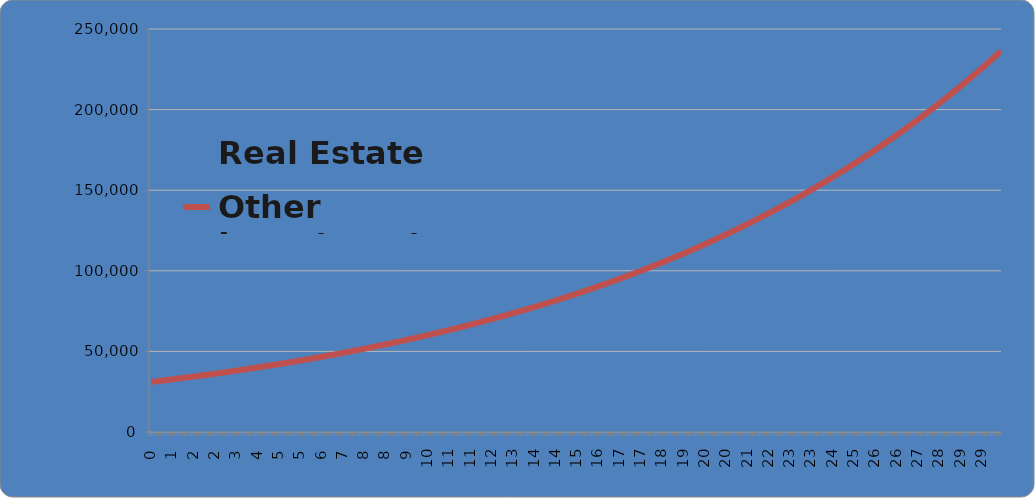
| Category | Real Estate | Other Investment |
|---|---|---|
| 0.08333333333333333 | 0 | 31063.032 |
| 0.16666666666666666 | 0 | 31239.056 |
| 0.25 | 0 | 31416.077 |
| 0.3333333333333333 | 0 | 31594.102 |
| 0.4166666666666667 | 0 | 31773.135 |
| 0.5 | 0 | 31953.183 |
| 0.5833333333333334 | 0 | 32134.251 |
| 0.6666666666666666 | 0 | 32316.345 |
| 0.75 | 0 | 32499.471 |
| 0.8333333333333334 | 0 | 32683.634 |
| 0.9166666666666666 | 0 | 32868.842 |
| 1.0 | 0 | 33055.098 |
| 1.0833333333333333 | 0 | 33242.411 |
| 1.1666666666666667 | 0 | 33430.784 |
| 1.25 | 0 | 33620.225 |
| 1.3333333333333333 | 0 | 33810.74 |
| 1.4166666666666667 | 0 | 34002.334 |
| 1.5 | 0 | 34195.014 |
| 1.5833333333333333 | 0 | 34388.786 |
| 1.6666666666666667 | 0 | 34583.656 |
| 1.75 | 0 | 34779.63 |
| 1.8333333333333333 | 0 | 34976.714 |
| 1.9166666666666667 | 0 | 35174.916 |
| 2.0 | 0 | 35374.24 |
| 2.0833333333333335 | 0 | 35574.694 |
| 2.1666666666666665 | 0 | 35776.284 |
| 2.25 | 0 | 35979.016 |
| 2.3333333333333335 | 0 | 36182.897 |
| 2.4166666666666665 | 0 | 36387.934 |
| 2.5 | 0 | 36594.132 |
| 2.5833333333333335 | 0 | 36801.499 |
| 2.6666666666666665 | 0 | 37010.041 |
| 2.75 | 0 | 37219.764 |
| 2.8333333333333335 | 0 | 37430.676 |
| 2.9166666666666665 | 0 | 37642.783 |
| 3.0 | 0 | 37856.093 |
| 3.0833333333333335 | 0 | 38070.61 |
| 3.1666666666666665 | 0 | 38286.344 |
| 3.25 | 0 | 38503.3 |
| 3.3333333333333335 | 0 | 38721.485 |
| 3.4166666666666665 | 0 | 38940.907 |
| 3.5 | 0 | 39161.572 |
| 3.5833333333333335 | 0 | 39383.488 |
| 3.6666666666666665 | 0 | 39606.661 |
| 3.75 | 0 | 39831.099 |
| 3.8333333333333335 | 0 | 40056.808 |
| 3.9166666666666665 | 0 | 40283.797 |
| 4.0 | 0 | 40512.071 |
| 4.083333333333333 | 0 | 40741.64 |
| 4.166666666666667 | 0 | 40972.509 |
| 4.25 | 0 | 41204.687 |
| 4.333333333333333 | 0 | 41438.18 |
| 4.416666666666667 | 0 | 41672.996 |
| 4.5 | 0 | 41909.143 |
| 4.583333333333333 | 0 | 42146.628 |
| 4.666666666666667 | 0 | 42385.459 |
| 4.75 | 0 | 42625.644 |
| 4.833333333333333 | 0 | 42867.189 |
| 4.916666666666667 | 0 | 43110.103 |
| 5.0 | 0 | 43354.394 |
| 5.083333333333333 | 0 | 43600.068 |
| 5.166666666666667 | 0 | 43847.136 |
| 5.25 | 0 | 44095.603 |
| 5.333333333333333 | 0 | 44345.478 |
| 5.416666666666667 | 0 | 44596.769 |
| 5.5 | 0 | 44849.484 |
| 5.583333333333333 | 0 | 45103.631 |
| 5.666666666666667 | 0 | 45359.218 |
| 5.75 | 0 | 45616.254 |
| 5.833333333333333 | 0 | 45874.746 |
| 5.916666666666667 | 0 | 46134.703 |
| 6.0 | 0 | 46396.133 |
| 6.083333333333333 | 0 | 46659.044 |
| 6.166666666666667 | 0 | 46923.445 |
| 6.25 | 0 | 47189.345 |
| 6.333333333333333 | 0 | 47456.751 |
| 6.416666666666667 | 0 | 47725.673 |
| 6.5 | 0 | 47996.118 |
| 6.583333333333333 | 0 | 48268.096 |
| 6.666666666666667 | 0 | 48541.615 |
| 6.75 | 0 | 48816.685 |
| 6.833333333333333 | 0 | 49093.312 |
| 6.916666666666667 | 0 | 49371.508 |
| 7.0 | 0 | 49651.28 |
| 7.083333333333333 | 0 | 49932.637 |
| 7.166666666666667 | 0 | 50215.589 |
| 7.25 | 0 | 50500.144 |
| 7.333333333333333 | 0 | 50786.311 |
| 7.416666666666667 | 0 | 51074.1 |
| 7.5 | 0 | 51363.52 |
| 7.583333333333333 | 0 | 51654.58 |
| 7.666666666666667 | 0 | 51947.289 |
| 7.75 | 0 | 52241.657 |
| 7.833333333333333 | 0 | 52537.693 |
| 7.916666666666667 | 0 | 52835.407 |
| 8.0 | 0 | 53134.808 |
| 8.083333333333334 | 0 | 53435.905 |
| 8.166666666666666 | 0 | 53738.708 |
| 8.25 | 0 | 54043.228 |
| 8.333333333333334 | 0 | 54349.473 |
| 8.416666666666666 | 0 | 54657.453 |
| 8.5 | 0 | 54967.179 |
| 8.583333333333334 | 0 | 55278.659 |
| 8.666666666666666 | 0 | 55591.905 |
| 8.75 | 0 | 55906.926 |
| 8.833333333333334 | 0 | 56223.732 |
| 8.916666666666666 | 0 | 56542.333 |
| 9.0 | 0 | 56862.739 |
| 9.083333333333334 | 0 | 57184.962 |
| 9.166666666666666 | 0 | 57509.01 |
| 9.25 | 0 | 57834.894 |
| 9.333333333333334 | 0 | 58162.625 |
| 9.416666666666666 | 0 | 58492.213 |
| 9.5 | 0 | 58823.669 |
| 9.583333333333334 | 0 | 59157.003 |
| 9.666666666666666 | 0 | 59492.226 |
| 9.75 | 0 | 59829.349 |
| 9.833333333333334 | 0 | 60168.382 |
| 9.916666666666666 | 0 | 60509.336 |
| 10.0 | 0 | 60852.222 |
| 10.083333333333334 | 0 | 61197.052 |
| 10.166666666666666 | 0 | 61543.835 |
| 10.25 | 0 | 61892.583 |
| 10.333333333333334 | 0 | 62243.308 |
| 10.416666666666666 | 0 | 62596.02 |
| 10.5 | 0 | 62950.731 |
| 10.583333333333334 | 0 | 63307.452 |
| 10.666666666666666 | 0 | 63666.194 |
| 10.75 | 0 | 64026.969 |
| 10.833333333333334 | 0 | 64389.788 |
| 10.916666666666666 | 0 | 64754.664 |
| 11.0 | 0 | 65121.607 |
| 11.083333333333334 | 0 | 65490.629 |
| 11.166666666666666 | 0 | 65861.743 |
| 11.25 | 0 | 66234.959 |
| 11.333333333333334 | 0 | 66610.291 |
| 11.416666666666666 | 0 | 66987.749 |
| 11.5 | 0 | 67367.346 |
| 11.583333333333334 | 0 | 67749.095 |
| 11.666666666666666 | 0 | 68133.006 |
| 11.75 | 0 | 68519.093 |
| 11.833333333333334 | 0 | 68907.368 |
| 11.916666666666666 | 0 | 69297.843 |
| 12.0 | 0 | 69690.531 |
| 12.083333333333334 | 0 | 70085.444 |
| 12.166666666666666 | 0 | 70482.595 |
| 12.25 | 0 | 70881.996 |
| 12.333333333333334 | 0 | 71283.661 |
| 12.416666666666666 | 0 | 71687.602 |
| 12.5 | 0 | 72093.831 |
| 12.583333333333334 | 0 | 72502.363 |
| 12.666666666666666 | 0 | 72913.21 |
| 12.75 | 0 | 73326.385 |
| 12.833333333333334 | 0 | 73741.901 |
| 12.916666666666666 | 0 | 74159.772 |
| 13.0 | 0 | 74580.01 |
| 13.083333333333334 | 0 | 75002.63 |
| 13.166666666666666 | 0 | 75427.645 |
| 13.25 | 0 | 75855.069 |
| 13.333333333333334 | 0 | 76284.914 |
| 13.416666666666666 | 0 | 76717.195 |
| 13.5 | 0 | 77151.926 |
| 13.583333333333334 | 0 | 77589.12 |
| 13.666666666666666 | 0 | 78028.792 |
| 13.75 | 0 | 78470.955 |
| 13.833333333333334 | 0 | 78915.624 |
| 13.916666666666666 | 0 | 79362.812 |
| 14.0 | 0 | 79812.535 |
| 14.083333333333334 | 0 | 80264.806 |
| 14.166666666666666 | 0 | 80719.64 |
| 14.25 | 0 | 81177.051 |
| 14.333333333333334 | 0 | 81637.055 |
| 14.416666666666666 | 0 | 82099.665 |
| 14.5 | 0 | 82564.896 |
| 14.583333333333334 | 0 | 83032.764 |
| 14.666666666666666 | 0 | 83503.283 |
| 14.75 | 0 | 83976.468 |
| 14.833333333333334 | 0 | 84452.335 |
| 14.916666666666666 | 0 | 84930.898 |
| 15.0 | 0 | 85412.173 |
| 15.083333333333334 | 0 | 85896.175 |
| 15.166666666666666 | 0 | 86382.92 |
| 15.25 | 0 | 86872.423 |
| 15.333333333333334 | 0 | 87364.7 |
| 15.416666666666666 | 0 | 87859.767 |
| 15.5 | 0 | 88357.639 |
| 15.583333333333334 | 0 | 88858.332 |
| 15.666666666666666 | 0 | 89361.863 |
| 15.75 | 0 | 89868.247 |
| 15.833333333333334 | 0 | 90377.5 |
| 15.916666666666666 | 0 | 90889.639 |
| 16.0 | 0 | 91404.681 |
| 16.083333333333332 | 0 | 91922.641 |
| 16.166666666666668 | 0 | 92443.536 |
| 16.25 | 0 | 92967.382 |
| 16.333333333333332 | 0 | 93494.197 |
| 16.416666666666668 | 0 | 94023.998 |
| 16.5 | 0 | 94556.801 |
| 16.583333333333332 | 0 | 95092.622 |
| 16.666666666666668 | 0 | 95631.481 |
| 16.75 | 0 | 96173.392 |
| 16.833333333333332 | 0 | 96718.375 |
| 16.916666666666668 | 0 | 97266.446 |
| 17.0 | 0 | 97817.622 |
| 17.083333333333332 | 0 | 98371.922 |
| 17.166666666666668 | 0 | 98929.363 |
| 17.25 | 0 | 99489.963 |
| 17.333333333333332 | 0 | 100053.739 |
| 17.416666666666668 | 0 | 100620.71 |
| 17.5 | 0 | 101190.894 |
| 17.583333333333332 | 0 | 101764.309 |
| 17.666666666666668 | 0 | 102340.974 |
| 17.75 | 0 | 102920.906 |
| 17.833333333333332 | 0 | 103504.124 |
| 17.916666666666668 | 0 | 104090.648 |
| 18.0 | 0 | 104680.495 |
| 18.083333333333332 | 0 | 105273.684 |
| 18.166666666666668 | 0 | 105870.235 |
| 18.25 | 0 | 106470.167 |
| 18.333333333333332 | 0 | 107073.497 |
| 18.416666666666668 | 0 | 107680.247 |
| 18.5 | 0 | 108290.435 |
| 18.583333333333332 | 0 | 108904.081 |
| 18.666666666666668 | 0 | 109521.204 |
| 18.75 | 0 | 110141.824 |
| 18.833333333333332 | 0 | 110765.961 |
| 18.916666666666668 | 0 | 111393.635 |
| 19.0 | 0 | 112024.866 |
| 19.083333333333332 | 0 | 112659.673 |
| 19.166666666666668 | 0 | 113298.078 |
| 19.25 | 0 | 113940.101 |
| 19.333333333333332 | 0 | 114585.761 |
| 19.416666666666668 | 0 | 115235.081 |
| 19.5 | 0 | 115888.079 |
| 19.583333333333332 | 0 | 116544.778 |
| 19.666666666666668 | 0 | 117205.199 |
| 19.75 | 0 | 117869.362 |
| 19.833333333333332 | 0 | 118537.288 |
| 19.916666666666668 | 0 | 119208.999 |
| 20.0 | 0 | 119884.517 |
| 20.083333333333332 | 0 | 120563.863 |
| 20.166666666666668 | 0 | 121247.058 |
| 20.25 | 0 | 121934.124 |
| 20.333333333333332 | 0 | 122625.085 |
| 20.416666666666668 | 0 | 123319.96 |
| 20.5 | 0 | 124018.773 |
| 20.583333333333332 | 0 | 124721.546 |
| 20.666666666666668 | 0 | 125428.302 |
| 20.75 | 0 | 126139.062 |
| 20.833333333333332 | 0 | 126853.85 |
| 20.916666666666668 | 0 | 127572.688 |
| 21.0 | 0 | 128295.6 |
| 21.083333333333332 | 0 | 129022.609 |
| 21.166666666666668 | 0 | 129753.737 |
| 21.25 | 0 | 130489.008 |
| 21.333333333333332 | 0 | 131228.446 |
| 21.416666666666668 | 0 | 131972.074 |
| 21.5 | 0 | 132719.915 |
| 21.583333333333332 | 0 | 133471.995 |
| 21.666666666666668 | 0 | 134228.336 |
| 21.75 | 0 | 134988.963 |
| 21.833333333333332 | 0 | 135753.901 |
| 21.916666666666668 | 0 | 136523.173 |
| 22.0 | 0 | 137296.804 |
| 22.083333333333332 | 0 | 138074.82 |
| 22.166666666666668 | 0 | 138857.244 |
| 22.25 | 0 | 139644.101 |
| 22.333333333333332 | 0 | 140435.418 |
| 22.416666666666668 | 0 | 141231.219 |
| 22.5 | 0 | 142031.529 |
| 22.583333333333332 | 0 | 142836.374 |
| 22.666666666666668 | 0 | 143645.78 |
| 22.75 | 0 | 144459.773 |
| 22.833333333333332 | 0 | 145278.378 |
| 22.916666666666668 | 0 | 146101.622 |
| 23.0 | 0 | 146929.532 |
| 23.083333333333332 | 0 | 147762.132 |
| 23.166666666666668 | 0 | 148599.451 |
| 23.25 | 0 | 149441.515 |
| 23.333333333333332 | 0 | 150288.35 |
| 23.416666666666668 | 0 | 151139.984 |
| 23.5 | 0 | 151996.444 |
| 23.583333333333332 | 0 | 152857.757 |
| 23.666666666666668 | 0 | 153723.951 |
| 23.75 | 0 | 154595.053 |
| 23.833333333333332 | 0 | 155471.092 |
| 23.916666666666668 | 0 | 156352.095 |
| 24.0 | 0 | 157238.09 |
| 24.083333333333332 | 0 | 158129.106 |
| 24.166666666666668 | 0 | 159025.171 |
| 24.25 | 0 | 159926.313 |
| 24.333333333333332 | 0 | 160832.563 |
| 24.416666666666668 | 0 | 161743.947 |
| 24.5 | 0 | 162660.496 |
| 24.583333333333332 | 0 | 163582.239 |
| 24.666666666666668 | 0 | 164509.205 |
| 24.75 | 0 | 165441.424 |
| 24.833333333333332 | 0 | 166378.925 |
| 24.916666666666668 | 0 | 167321.739 |
| 25.0 | 0 | 168269.896 |
| 25.083333333333332 | 0 | 169223.425 |
| 25.166666666666668 | 0 | 170182.358 |
| 25.25 | 0 | 171146.724 |
| 25.333333333333332 | 0 | 172116.556 |
| 25.416666666666668 | 0 | 173091.883 |
| 25.5 | 0 | 174072.737 |
| 25.583333333333332 | 0 | 175059.149 |
| 25.666666666666668 | 0 | 176051.151 |
| 25.75 | 0 | 177048.774 |
| 25.833333333333332 | 0 | 178052.051 |
| 25.916666666666668 | 0 | 179061.012 |
| 26.0 | 0 | 180075.691 |
| 26.083333333333332 | 0 | 181096.12 |
| 26.166666666666668 | 0 | 182122.332 |
| 26.25 | 0 | 183154.358 |
| 26.333333333333332 | 0 | 184192.233 |
| 26.416666666666668 | 0 | 185235.989 |
| 26.5 | 0 | 186285.659 |
| 26.583333333333332 | 0 | 187341.278 |
| 26.666666666666668 | 0 | 188402.879 |
| 26.75 | 0 | 189470.495 |
| 26.833333333333332 | 0 | 190544.161 |
| 26.916666666666668 | 0 | 191623.911 |
| 27.0 | 0 | 192709.78 |
| 27.083333333333332 | 0 | 193801.802 |
| 27.166666666666668 | 0 | 194900.013 |
| 27.25 | 0 | 196004.446 |
| 27.333333333333332 | 0 | 197115.138 |
| 27.416666666666668 | 0 | 198232.124 |
| 27.5 | 0 | 199355.439 |
| 27.583333333333332 | 0 | 200485.12 |
| 27.666666666666668 | 0 | 201621.202 |
| 27.75 | 0 | 202763.722 |
| 27.833333333333332 | 0 | 203912.717 |
| 27.916666666666668 | 0 | 205068.222 |
| 28.0 | 0 | 206230.275 |
| 28.083333333333332 | 0 | 207398.914 |
| 28.166666666666668 | 0 | 208574.174 |
| 28.25 | 0 | 209756.094 |
| 28.333333333333332 | 0 | 210944.712 |
| 28.416666666666668 | 0 | 212140.066 |
| 28.5 | 0 | 213342.193 |
| 28.583333333333332 | 0 | 214551.132 |
| 28.666666666666668 | 0 | 215766.922 |
| 28.75 | 0 | 216989.601 |
| 28.833333333333332 | 0 | 218219.208 |
| 28.916666666666668 | 0 | 219455.784 |
| 29.0 | 0 | 220699.367 |
| 29.083333333333332 | 0 | 221949.997 |
| 29.166666666666668 | 0 | 223207.713 |
| 29.25 | 0 | 224472.557 |
| 29.333333333333332 | 0 | 225744.568 |
| 29.416666666666668 | 0 | 227023.787 |
| 29.5 | 0 | 228310.255 |
| 29.583333333333332 | 0 | 229604.013 |
| 29.666666666666668 | 0 | 230905.103 |
| 29.75 | 0 | 232213.565 |
| 29.833333333333332 | 0 | 233529.442 |
| 29.916666666666668 | 0 | 234852.776 |
| 30.0 | 0 | 236183.608 |